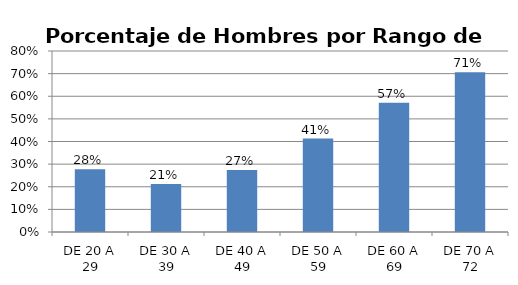
| Category | Porcentaje |
|---|---|
| DE 20 A 29 | 0.278 |
| DE 30 A 39 | 0.212 |
| DE 40 A 49 | 0.274 |
| DE 50 A 59 | 0.413 |
| DE 60 A 69 | 0.571 |
| DE 70 A 72 | 0.706 |